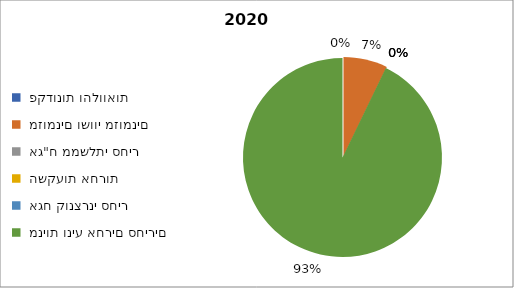
| Category | מנורה מבטחים השתלמות מסלול מניות חו"ל [1409] - פברואר 2020 |
|---|---|
|  פקדונות והלוואות  | 0 |
|  מזומנים ושווי מזומנים   | 4473 |
|  אג"ח ממשלתי סחיר  | 0 |
|  השקעות אחרות  | 0 |
|  אגח קונצרני סחיר  | 0 |
|  מניות וניע אחרים סחירים   | 57962 |